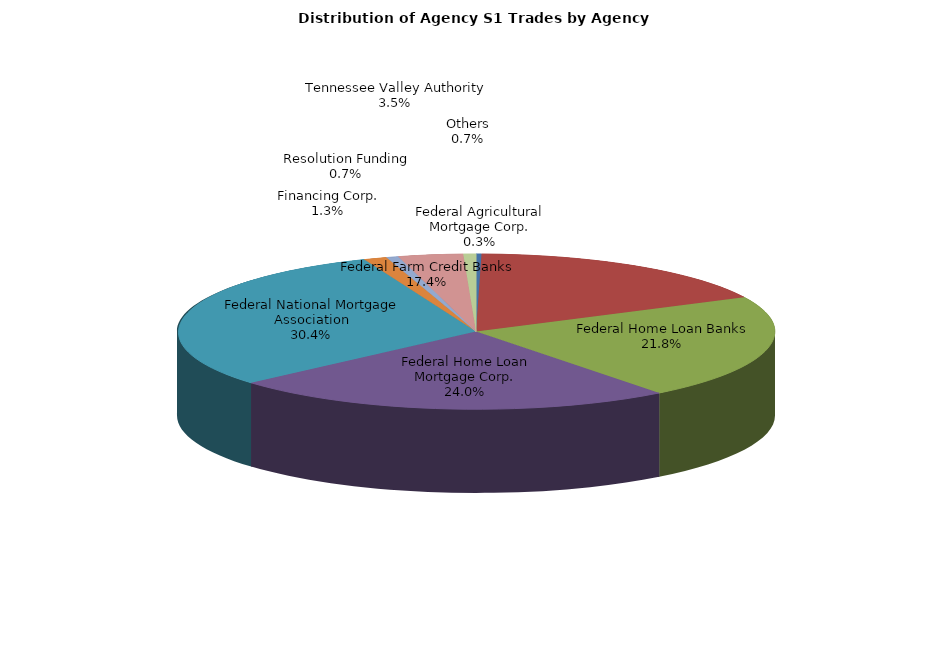
| Category | Series 0 |
|---|---|
| Federal Agricultural Mortgage Corp. | 7.25 |
| Federal Farm Credit Banks | 427.421 |
| Federal Home Loan Banks | 535.968 |
| Federal Home Loan Mortgage Corp. | 590.583 |
| Federal National Mortgage Association | 746.008 |
| Financing Corp. | 30.825 |
| Resolution Funding | 16.147 |
| Tennessee Valley Authority | 86.024 |
| Others | 16.706 |